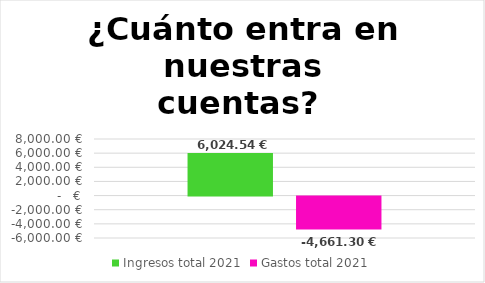
| Category | Ingresos total 2021 | Gastos total 2021 |
|---|---|---|
| 0 | 6024.54 | -4661.3 |